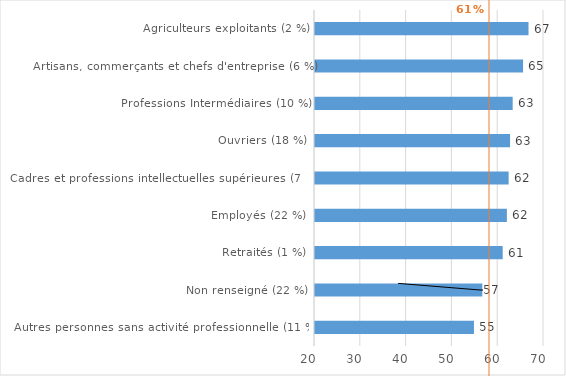
| Category | Taux d'emploi |
|---|---|
| Autres personnes sans activité professionnelle (11 %) | 54.71 |
| Non renseigné (22 %) | 56.53 |
| Retraités (1 %) | 60.98 |
| Employés (22 %) | 61.9 |
| Cadres et professions intellectuelles supérieures (7 %) | 62.28 |
| Ouvriers (18 %) | 62.59 |
| Professions Intermédiaires (10 %) | 63.16 |
| Artisans, commerçants et chefs d'entreprise (6 %) | 65.43 |
| Agriculteurs exploitants (2 %) | 66.62 |